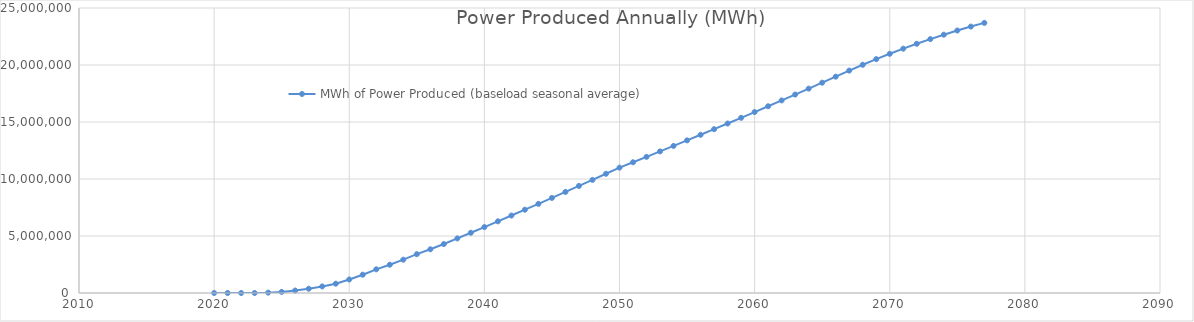
| Category | MWh of Power Produced (baseload seasonal average) |
|---|---|
| 2020.0 | 0 |
| 2021.0 | 0 |
| 2022.0 | 0 |
| 2023.0 | 0 |
| 2024.0 | 32298.189 |
| 2025.0 | 96894.567 |
| 2026.0 | 215987.95 |
| 2027.0 | 375682.158 |
| 2028.0 | 575977.189 |
| 2029.0 | 817414.863 |
| 2030.0 | 1184216.838 |
| 2031.0 | 1605276.756 |
| 2032.0 | 2077714.245 |
| 2033.0 | 2481212.649 |
| 2034.0 | 2924056.957 |
| 2035.0 | 3406247.17 |
| 2036.0 | 3834478.115 |
| 2037.0 | 4294835.966 |
| 2038.0 | 4787320.722 |
| 2039.0 | 5283598.203 |
| 2040.0 | 5783668.412 |
| 2041.0 | 6287531.346 |
| 2042.0 | 6795187.007 |
| 2043.0 | 7306635.394 |
| 2044.0 | 7821876.507 |
| 2045.0 | 8341452.165 |
| 2046.0 | 8864820.548 |
| 2047.0 | 9391981.658 |
| 2048.0 | 9922935.495 |
| 2049.0 | 10458223.875 |
| 2050.0 | 10997304.982 |
| 2051.0 | 11468530.641 |
| 2052.0 | 11943007.208 |
| 2053.0 | 12421276.501 |
| 2054.0 | 12903338.521 |
| 2055.0 | 13388651.448 |
| 2056.0 | 13877757.102 |
| 2057.0 | 14370655.483 |
| 2058.0 | 14867346.589 |
| 2059.0 | 15367830.422 |
| 2060.0 | 15872106.981 |
| 2061.0 | 16380176.266 |
| 2062.0 | 16892038.278 |
| 2063.0 | 17407693.015 |
| 2064.0 | 17927140.479 |
| 2065.0 | 18450380.67 |
| 2066.0 | 18977955.404 |
| 2067.0 | 19509322.865 |
| 2068.0 | 20020419.721 |
| 2069.0 | 20511787.791 |
| 2070.0 | 20982343.438 |
| 2071.0 | 21432628.481 |
| 2072.0 | 21862101.101 |
| 2073.0 | 22270761.299 |
| 2074.0 | 22658609.073 |
| 2075.0 | 23025102.608 |
| 2076.0 | 23370241.901 |
| 2077.0 | 23694026.954 |